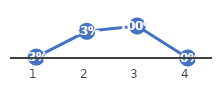
| Category | Series 0 |
|---|---|
| 0 | 0.029 |
| 1 | 0.833 |
| 2 | 1 |
| 3 | 0 |